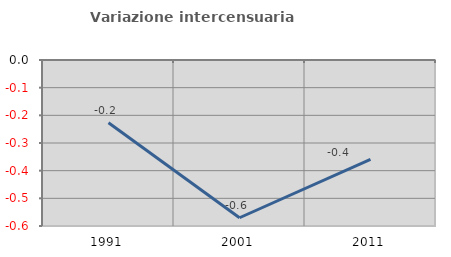
| Category | Variazione intercensuaria annua |
|---|---|
| 1991.0 | -0.227 |
| 2001.0 | -0.57 |
| 2011.0 | -0.359 |